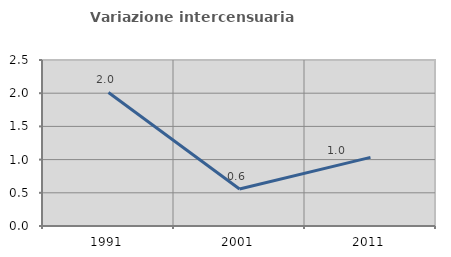
| Category | Variazione intercensuaria annua |
|---|---|
| 1991.0 | 2.012 |
| 2001.0 | 0.558 |
| 2011.0 | 1.033 |